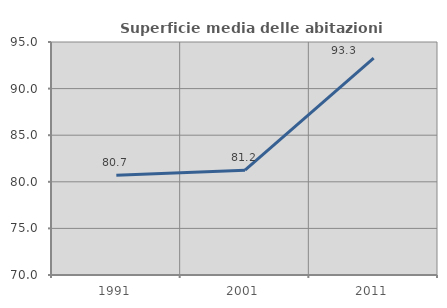
| Category | Superficie media delle abitazioni occupate |
|---|---|
| 1991.0 | 80.693 |
| 2001.0 | 81.241 |
| 2011.0 | 93.258 |